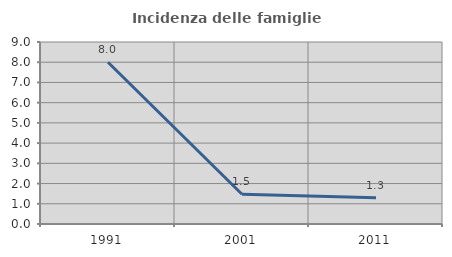
| Category | Incidenza delle famiglie numerose |
|---|---|
| 1991.0 | 8 |
| 2001.0 | 1.471 |
| 2011.0 | 1.299 |